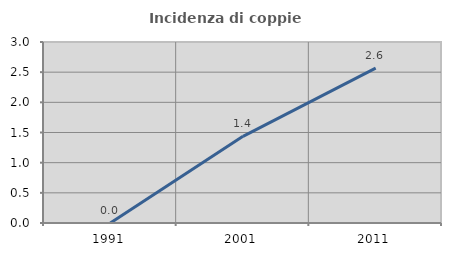
| Category | Incidenza di coppie miste |
|---|---|
| 1991.0 | 0 |
| 2001.0 | 1.437 |
| 2011.0 | 2.568 |